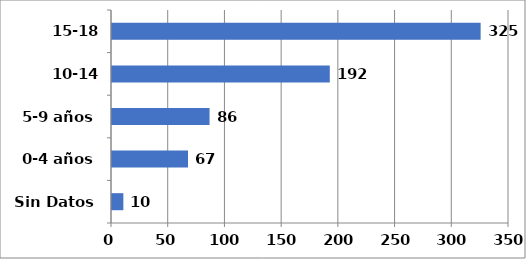
| Category | Series 0 |
|---|---|
| Sin Datos | 10 |
| 0-4 años | 67 |
| 5-9 años | 86 |
| 10-14 años | 192 |
| 15-18 años | 325 |